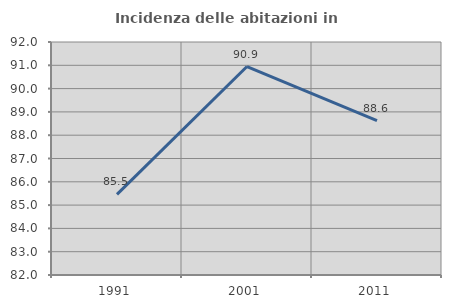
| Category | Incidenza delle abitazioni in proprietà  |
|---|---|
| 1991.0 | 85.463 |
| 2001.0 | 90.947 |
| 2011.0 | 88.627 |